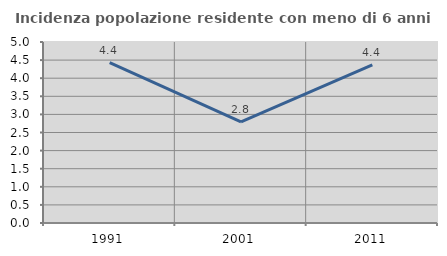
| Category | Incidenza popolazione residente con meno di 6 anni |
|---|---|
| 1991.0 | 4.43 |
| 2001.0 | 2.796 |
| 2011.0 | 4.366 |